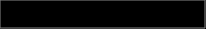
| Category | Series 0 |
|---|---|
| 0 | 0.182 |
| 1 | 0.728 |
| 2 | 0.09 |